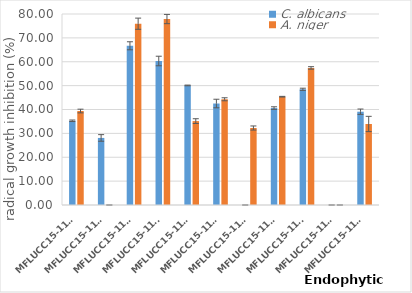
| Category | C. albicans | A. niger |
|---|---|---|
| MFLUCC15-1112 | 35.273 | 39.363 |
| MFLUCC15-1113 | 28.093 | 0 |
| MFLUCC15-1130 | 66.687 | 75.933 |
| MFLUCC15-1131 | 60.313 | 77.887 |
| MFLUCC15-1132 | 50.083 | 35.14 |
| MFLUCC15-1133 | 42.507 | 44.283 |
| MFLUCC15-1134 | 0 | 32.247 |
| MFLUCC15-1135 | 40.593 | 45.363 |
| MFLUCC15-1136 | 48.467 | 57.413 |
| MFLUCC15-1137 | 0 | 0 |
| MFLUCC15-1138 | 39.077 | 33.937 |